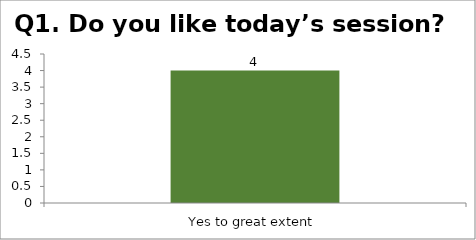
| Category | Q1. Do you like today’s session? |
|---|---|
| Yes to great extent | 4 |